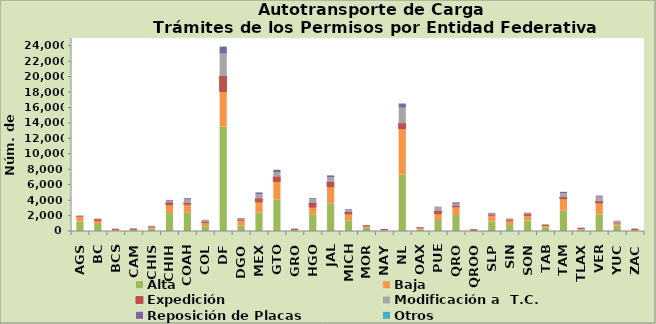
| Category | Alta                                         | Baja | Expedición | Modificación a  T.C. | Reposición de Placas | Otros |
|---|---|---|---|---|---|---|
| AGS | 1221 | 591 | 63 | 71 | 54 | 3 |
| BC | 910 | 412 | 164 | 91 | 29 | 10 |
| BCS | 92 | 81 | 12 | 19 | 1 | 1 |
| CAM | 127 | 59 | 39 | 29 | 10 | 0 |
| CHIS | 308 | 180 | 58 | 118 | 11 | 4 |
| CHIH | 2319 | 1019 | 349 | 229 | 108 | 4 |
| COAH | 2434 | 979 | 237 | 419 | 177 | 4 |
| COL | 613 | 440 | 143 | 211 | 46 | 1 |
| DF | 13517 | 4510 | 2072 | 2880 | 863 | 70 |
| DGO | 674 | 711 | 58 | 97 | 105 | 13 |
| MEX | 2408 | 1305 | 493 | 585 | 199 | 19 |
| GTO | 4059 | 2294 | 690 | 593 | 287 | 16 |
| GRO | 105 | 68 | 33 | 10 | 5 | 6 |
| HGO | 2110 | 924 | 616 | 489 | 107 | 14 |
| JAL | 3576 | 2095 | 708 | 595 | 224 | 30 |
| MICH | 1367 | 791 | 318 | 255 | 82 | 15 |
| MOR | 420 | 205 | 60 | 53 | 33 | 7 |
| NAY | 81 | 59 | 27 | 22 | 10 | 0 |
| NL | 7331 | 5856 | 766 | 2016 | 525 | 47 |
| OAX | 217 | 151 | 65 | 77 | 10 | 3 |
| PUE | 1437 | 739 | 415 | 474 | 80 | 11 |
| QRO | 2062 | 1005 | 209 | 243 | 193 | 9 |
| QROO | 53 | 41 | 18 | 45 | 5 | 0 |
| SLP | 1231 | 769 | 119 | 156 | 80 | 4 |
| SIN | 766 | 513 | 113 | 187 | 44 | 2 |
| SON | 1345 | 612 | 223 | 124 | 68 | 6 |
| TAB | 476 | 178 | 96 | 106 | 5 | 0 |
| TAM | 2631 | 1495 | 265 | 513 | 160 | 13 |
| TLAX | 162 | 137 | 26 | 9 | 13 | 2 |
| VER | 2173 | 1402 | 295 | 579 | 136 | 7 |
| YUC | 693 | 325 | 47 | 201 | 63 | 6 |
| ZAC | 52 | 121 | 29 | 3 | 4 | 0 |